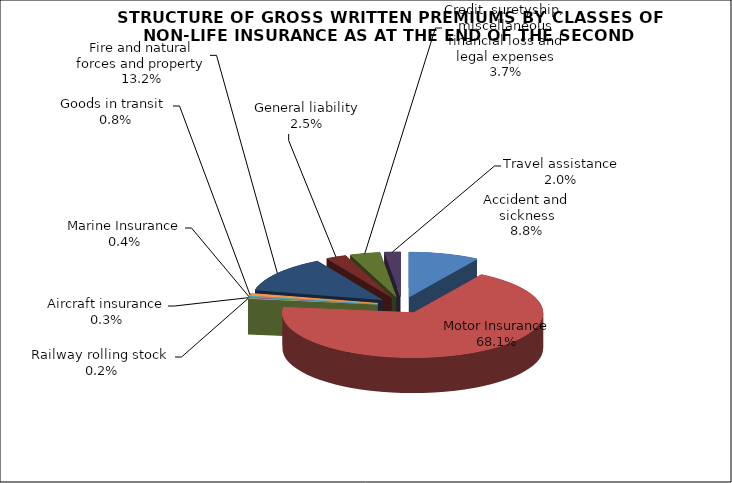
| Category | Accident and sickness |
|---|---|
| Accident and sickness | 0.088 |
| Motor Insurance | 0.681 |
| Railway rolling stock  | 0.002 |
| Aircraft insurance | 0.003 |
| Marine Insurance | 0.004 |
| Goods in transit  | 0.008 |
| Fire and natural forces and property | 0.132 |
| General liability | 0.025 |
| Credit, suretyship, miscellaneous financial loss and legal expenses | 0.037 |
| Travel assistance | 0.02 |